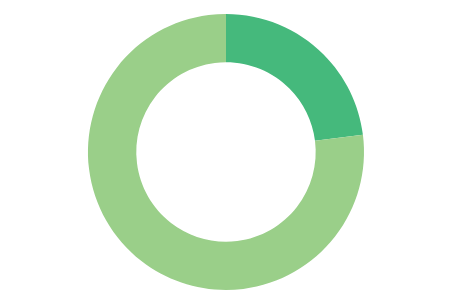
| Category | Series 0 |
|---|---|
| 0 | 23 |
| 1 | 77 |